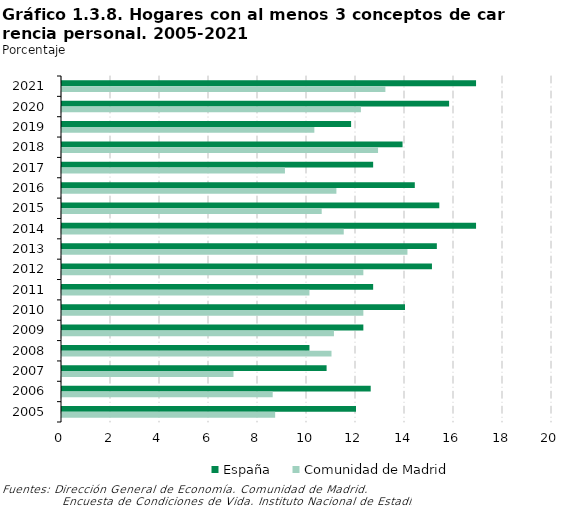
| Category | España | Comunidad de Madrid |
|---|---|---|
| 2021 | 16.9 | 13.2 |
| 2020 | 15.8 | 12.2 |
| 2019 | 11.8 | 10.3 |
| 2018 | 13.9 | 12.9 |
| 2017 | 12.7 | 9.1 |
| 2016 | 14.4 | 11.2 |
| 2015 | 15.4 | 10.6 |
| 2014 | 16.9 | 11.5 |
| 2013 | 15.3 | 14.1 |
| 2012 | 15.1 | 12.3 |
| 2011 | 12.7 | 10.1 |
| 2010 | 14 | 12.3 |
| 2009 | 12.3 | 11.1 |
| 2008 | 10.1 | 11 |
| 2007 | 10.8 | 7 |
| 2006 | 12.6 | 8.6 |
| 2005 | 12 | 8.7 |